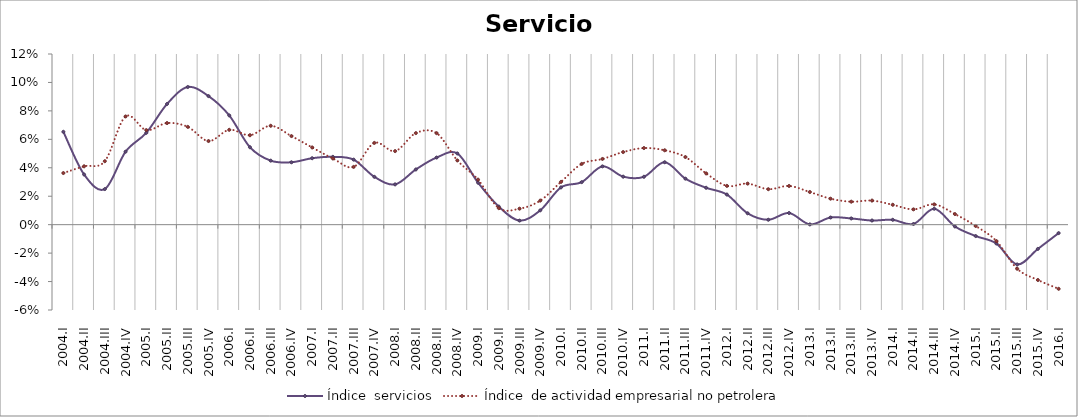
| Category | Índice  servicios | Índice  de actividad empresarial no petrolera |
|---|---|---|
| 2004.I | 0.065 | 0.036 |
| 2004.II | 0.035 | 0.041 |
| 2004.III | 0.025 | 0.045 |
| 2004.IV | 0.051 | 0.076 |
| 2005.I | 0.065 | 0.066 |
| 2005.II | 0.085 | 0.071 |
| 2005.III | 0.097 | 0.069 |
| 2005.IV | 0.09 | 0.059 |
| 2006.I | 0.077 | 0.067 |
| 2006.II | 0.054 | 0.063 |
| 2006.III | 0.045 | 0.07 |
| 2006.IV | 0.044 | 0.062 |
| 2007.I | 0.047 | 0.054 |
| 2007.II | 0.048 | 0.047 |
| 2007.III | 0.046 | 0.041 |
| 2007.IV | 0.034 | 0.057 |
| 2008.I | 0.028 | 0.052 |
| 2008.II | 0.039 | 0.064 |
| 2008.III | 0.047 | 0.064 |
| 2008.IV | 0.05 | 0.045 |
| 2009.I | 0.03 | 0.032 |
| 2009.II | 0.013 | 0.012 |
| 2009.III | 0.003 | 0.011 |
| 2009.IV | 0.01 | 0.017 |
| 2010.I | 0.026 | 0.03 |
| 2010.II | 0.03 | 0.043 |
| 2010.III | 0.041 | 0.046 |
| 2010.IV | 0.034 | 0.051 |
| 2011.I | 0.034 | 0.054 |
| 2011.II | 0.044 | 0.052 |
| 2011.III | 0.032 | 0.048 |
| 2011.IV | 0.026 | 0.036 |
| 2012.I | 0.021 | 0.027 |
| 2012.II | 0.008 | 0.029 |
| 2012.III | 0.003 | 0.025 |
| 2012.IV | 0.008 | 0.027 |
| 2013.I | 0 | 0.023 |
| 2013.II | 0.005 | 0.018 |
| 2013.III | 0.004 | 0.016 |
| 2013.IV | 0.003 | 0.017 |
| 2014.I | 0.003 | 0.014 |
| 2014.II | 0 | 0.011 |
| 2014.III | 0.011 | 0.014 |
| 2014.IV | -0.001 | 0.007 |
| 2015.I | -0.008 | -0.001 |
| 2015.II | -0.013 | -0.012 |
| 2015.III | -0.028 | -0.031 |
| 2015.IV | -0.017 | -0.039 |
| 2016.I | -0.006 | -0.045 |